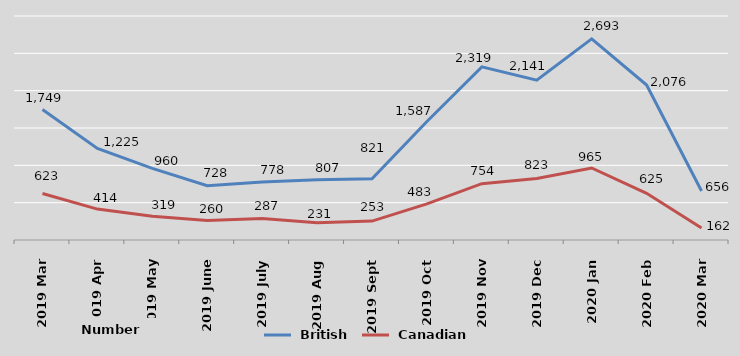
| Category |  British |  Canadian |
|---|---|---|
| 2019 Mar | 1749 | 623 |
| 2019 Apr | 1225 | 414 |
| 2019 May | 960 | 319 |
| 2019 June | 728 | 260 |
| 2019 July | 778 | 287 |
| 2019 Aug | 807 | 231 |
| 2019 Sept | 821 | 253 |
| 2019 Oct | 1587 | 483 |
| 2019 Nov | 2319 | 754 |
| 2019 Dec | 2141 | 823 |
| 2020 Jan | 2693 | 965 |
| 2020 Feb | 2076 | 625 |
| 2020 Mar | 656 | 162 |